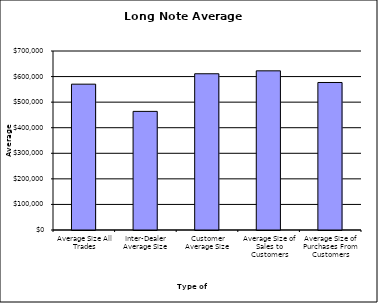
| Category | Security Type |
|---|---|
| Average Size All Trades | 570291.55 |
| Inter-Dealer Average Size | 463865.01 |
| Customer Average Size | 611014.563 |
| Average Size of Sales to Customers | 622424.602 |
| Average Size of Purchases From Customers | 576819.728 |